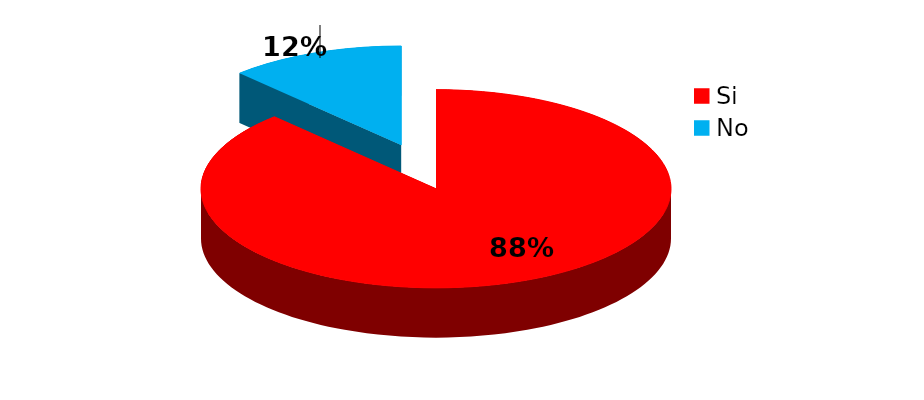
| Category | Series 0 |
|---|---|
| Si | 51 |
| No | 7 |